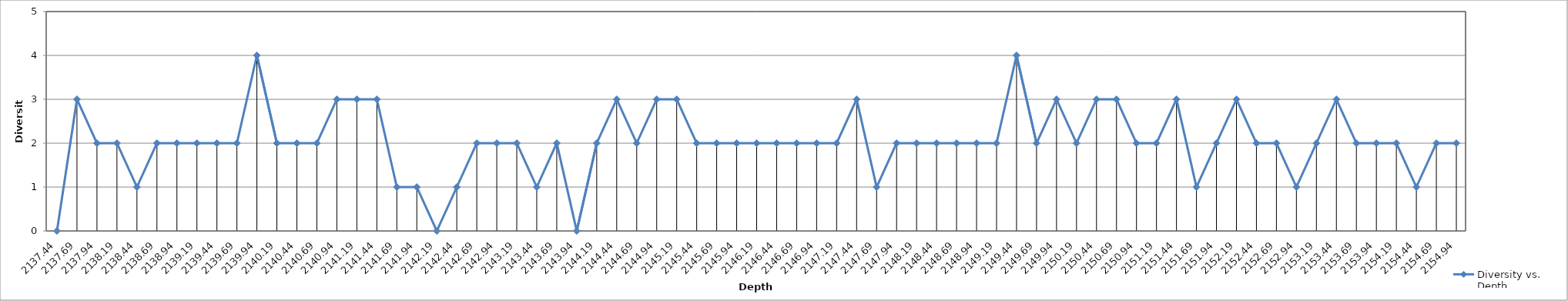
| Category | Diversity vs. Depth |
|---|---|
| 2137.44 | 0 |
| 2137.69 | 3 |
| 2137.94 | 2 |
| 2138.19 | 2 |
| 2138.44 | 1 |
| 2138.69 | 2 |
| 2138.94 | 2 |
| 2139.19 | 2 |
| 2139.44 | 2 |
| 2139.69 | 2 |
| 2139.94 | 4 |
| 2140.19 | 2 |
| 2140.44 | 2 |
| 2140.69 | 2 |
| 2140.94 | 3 |
| 2141.19 | 3 |
| 2141.44 | 3 |
| 2141.69 | 1 |
| 2141.94 | 1 |
| 2142.19 | 0 |
| 2142.44 | 1 |
| 2142.69 | 2 |
| 2142.94 | 2 |
| 2143.19 | 2 |
| 2143.44 | 1 |
| 2143.69 | 2 |
| 2143.94 | 0 |
| 2144.19 | 2 |
| 2144.44 | 3 |
| 2144.69 | 2 |
| 2144.94 | 3 |
| 2145.19 | 3 |
| 2145.44 | 2 |
| 2145.69 | 2 |
| 2145.94 | 2 |
| 2146.19 | 2 |
| 2146.44 | 2 |
| 2146.69 | 2 |
| 2146.94 | 2 |
| 2147.19 | 2 |
| 2147.44 | 3 |
| 2147.69 | 1 |
| 2147.94 | 2 |
| 2148.19 | 2 |
| 2148.44 | 2 |
| 2148.69 | 2 |
| 2148.94 | 2 |
| 2149.19 | 2 |
| 2149.44 | 4 |
| 2149.69 | 2 |
| 2149.94 | 3 |
| 2150.19 | 2 |
| 2150.44 | 3 |
| 2150.69 | 3 |
| 2150.94 | 2 |
| 2151.19 | 2 |
| 2151.44 | 3 |
| 2151.69 | 1 |
| 2151.94 | 2 |
| 2152.19 | 3 |
| 2152.44 | 2 |
| 2152.69 | 2 |
| 2152.94 | 1 |
| 2153.19 | 2 |
| 2153.44 | 3 |
| 2153.69 | 2 |
| 2153.94 | 2 |
| 2154.19 | 2 |
| 2154.44 | 1 |
| 2154.69 | 2 |
| 2154.94 | 2 |